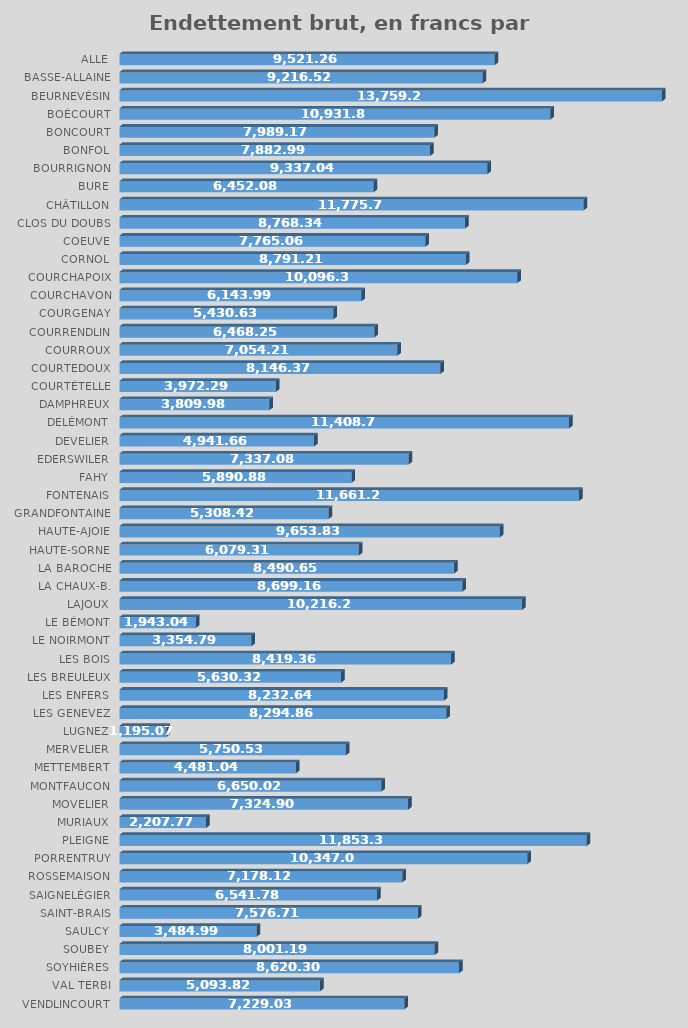
| Category | Series 0 |
|---|---|
| Alle | 9521.263 |
| Basse-Allaine | 9216.516 |
| Beurnevésin | 13759.279 |
| Boécourt | 10931.844 |
| Boncourt | 7989.171 |
| Bonfol | 7882.99 |
| Bourrignon | 9337.037 |
| Bure | 6452.08 |
| Châtillon | 11775.711 |
| Clos du Doubs | 8768.336 |
| Coeuve | 7765.055 |
| Cornol | 8791.213 |
| Courchapoix | 10096.369 |
| Courchavon | 6143.994 |
| Courgenay | 5430.631 |
| Courrendlin | 6468.248 |
| Courroux | 7054.213 |
| Courtedoux | 8146.37 |
| Courtételle | 3972.286 |
| Damphreux | 3809.976 |
| Delémont | 11408.697 |
| Develier | 4941.658 |
| Ederswiler | 7337.081 |
| Fahy | 5890.877 |
| Fontenais | 11661.222 |
| Grandfontaine | 5308.421 |
| Haute-Ajoie | 9653.833 |
| Haute-Sorne | 6079.31 |
| La Baroche | 8490.654 |
| La Chaux-B. | 8699.16 |
| Lajoux | 10216.27 |
| Le Bémont | 1943.036 |
| Le Noirmont | 3354.794 |
| Les Bois | 8419.357 |
| Les Breuleux | 5630.325 |
| Les Enfers | 8232.639 |
| Les Genevez | 8294.856 |
| Lugnez | 1195.068 |
| Mervelier | 5750.534 |
| Mettembert | 4481.044 |
| Montfaucon | 6650.017 |
| Movelier | 7324.898 |
| Muriaux | 2207.767 |
| Pleigne | 11853.385 |
| Porrentruy | 10347.085 |
| Rossemaison | 7178.117 |
| Saignelégier | 6541.781 |
| Saint-Brais | 7576.713 |
| Saulcy | 3484.986 |
| Soubey | 8001.19 |
| Soyhières | 8620.296 |
| Val Terbi | 5093.818 |
| Vendlincourt | 7229.026 |